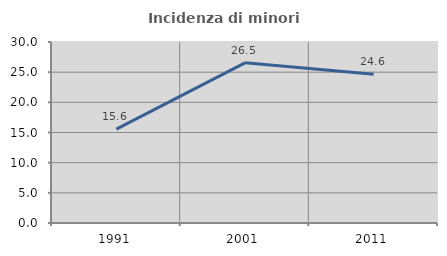
| Category | Incidenza di minori stranieri |
|---|---|
| 1991.0 | 15.556 |
| 2001.0 | 26.542 |
| 2011.0 | 24.639 |